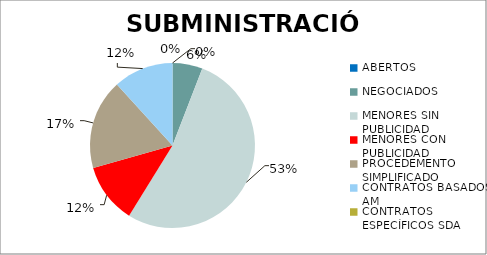
| Category | Series 0 |
|---|---|
| ABERTOS  | 0 |
| NEGOCIADOS  | 0.059 |
| MENORES SIN PUBLICIDAD | 0.529 |
| MENORES CON PUBLICIDAD | 0.118 |
| PROCEDEMENTO SIMPLIFICADO | 0.176 |
| CONTRATOS BASADOS AM | 0.118 |
| CONTRATOS ESPECÍFICOS SDA | 0 |